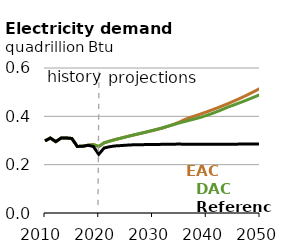
| Category | EAC | DAC | Reference |
|---|---|---|---|
| 2010.0 | 0.299 | 0.299 | 0.299 |
| 2011.0 | 0.31 | 0.31 | 0.31 |
| 2012.0 | 0.295 | 0.295 | 0.295 |
| 2013.0 | 0.31 | 0.31 | 0.31 |
| 2014.0 | 0.31 | 0.31 | 0.31 |
| 2015.0 | 0.308 | 0.308 | 0.308 |
| 2016.0 | 0.276 | 0.276 | 0.276 |
| 2017.0 | 0.276 | 0.276 | 0.276 |
| 2018.0 | 0.28 | 0.28 | 0.28 |
| 2019.0 | 0.283 | 0.283 | 0.275 |
| 2020.0 | 0.275 | 0.275 | 0.243 |
| 2021.0 | 0.29 | 0.29 | 0.269 |
| 2022.0 | 0.297 | 0.297 | 0.274 |
| 2023.0 | 0.304 | 0.304 | 0.277 |
| 2024.0 | 0.309 | 0.309 | 0.279 |
| 2025.0 | 0.315 | 0.315 | 0.28 |
| 2026.0 | 0.32 | 0.32 | 0.282 |
| 2027.0 | 0.325 | 0.326 | 0.282 |
| 2028.0 | 0.331 | 0.331 | 0.283 |
| 2029.0 | 0.336 | 0.336 | 0.283 |
| 2030.0 | 0.341 | 0.342 | 0.283 |
| 2031.0 | 0.346 | 0.347 | 0.284 |
| 2032.0 | 0.352 | 0.354 | 0.284 |
| 2033.0 | 0.36 | 0.36 | 0.285 |
| 2034.0 | 0.368 | 0.366 | 0.285 |
| 2035.0 | 0.376 | 0.373 | 0.285 |
| 2036.0 | 0.387 | 0.379 | 0.285 |
| 2037.0 | 0.395 | 0.384 | 0.285 |
| 2038.0 | 0.402 | 0.39 | 0.284 |
| 2039.0 | 0.41 | 0.396 | 0.284 |
| 2040.0 | 0.418 | 0.403 | 0.284 |
| 2041.0 | 0.426 | 0.411 | 0.284 |
| 2042.0 | 0.434 | 0.419 | 0.285 |
| 2043.0 | 0.443 | 0.428 | 0.285 |
| 2044.0 | 0.452 | 0.438 | 0.285 |
| 2045.0 | 0.462 | 0.446 | 0.285 |
| 2046.0 | 0.472 | 0.454 | 0.285 |
| 2047.0 | 0.482 | 0.463 | 0.285 |
| 2048.0 | 0.493 | 0.471 | 0.285 |
| 2049.0 | 0.504 | 0.481 | 0.285 |
| 2050.0 | 0.515 | 0.49 | 0.286 |